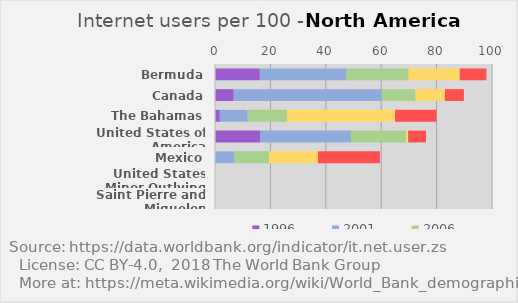
| Category | 1996 | 2001 | 2006 | 2011 | 2016 |
|---|---|---|---|---|---|
| Bermuda | 16.2 | 31.31 | 22.39 | 18.44 | 9.66 |
| Canada | 6.76 | 53.44 | 12.2 | 10.6 | 6.84 |
| The Bahamas | 1.75 | 10.05 | 14.2 | 39 | 15 |
| United States of America | 16.42 | 32.66 | 19.85 | 0.8 | 6.45 |
| Mexico | 0.2 | 6.84 | 12.48 | 17.66 | 22.36 |
| United States Minor Outlying Islands | 0 | 0 | 0 | 0 | 0 |
| Saint Pierre and Miquelon | 0 | 0 | 0 | 0 | 0 |